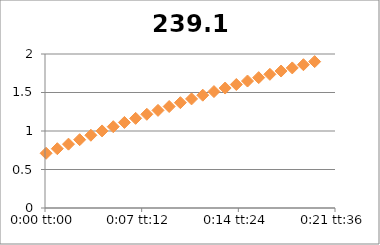
| Category | 239.1 |
|---|---|
| 5.78703703703704e-05 | 0.711 |
| 0.000636574074074074 | 0.77 |
| 0.00121527777777778 | 0.829 |
| 0.00179398148148148 | 0.887 |
| 0.00237268518518518 | 0.945 |
| 0.00295138888888889 | 1.001 |
| 0.00353009259259259 | 1.056 |
| 0.0041087962962963 | 1.111 |
| 0.0046875 | 1.164 |
| 0.0052662037037037 | 1.217 |
| 0.00584490740740741 | 1.268 |
| 0.00642361111111111 | 1.318 |
| 0.00700231481481481 | 1.368 |
| 0.00758101851851852 | 1.417 |
| 0.00815972222222222 | 1.465 |
| 0.00873842592592592 | 1.512 |
| 0.00931712962962963 | 1.558 |
| 0.00989583333333333 | 1.604 |
| 0.010474537037037 | 1.649 |
| 0.0110532407407407 | 1.693 |
| 0.0116319444444444 | 1.736 |
| 0.0122106481481481 | 1.779 |
| 0.0127893518518518 | 1.819 |
| 0.0133680555555556 | 1.861 |
| 0.0139467592592593 | 1.901 |